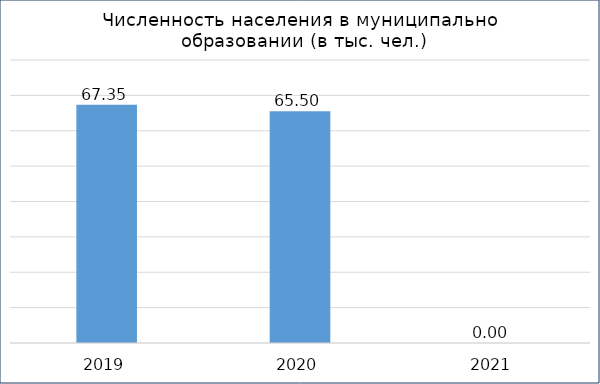
| Category | Series 2 |
|---|---|
| 2019.0 | 67.35 |
| 2020.0 | 65.5 |
| 2021.0 | 0 |